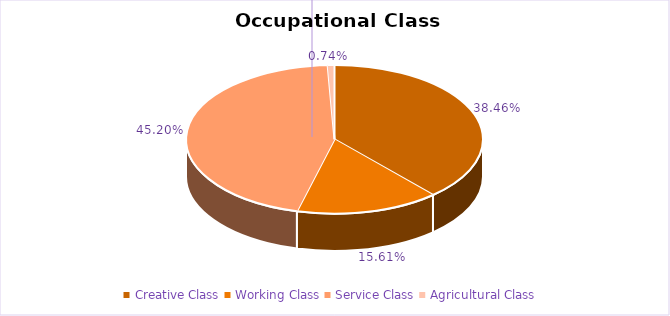
| Category | Toronto |
|---|---|
| Creative Class | 0.385 |
| Working Class | 0.156 |
| Service Class | 0.452 |
| Agricultural Class | 0.007 |